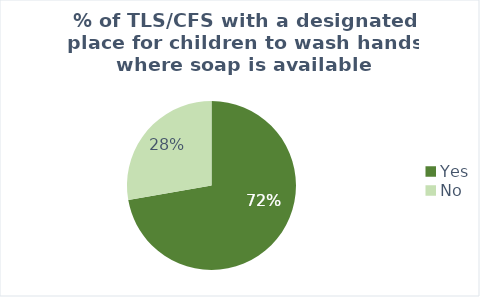
| Category | Average of % of TLS/CFS with a designated place for children to wash hands where soap is available |
|---|---|
| Yes | 0.722 |
| No | 0.278 |